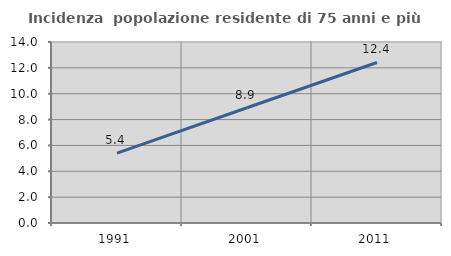
| Category | Incidenza  popolazione residente di 75 anni e più |
|---|---|
| 1991.0 | 5.406 |
| 2001.0 | 8.913 |
| 2011.0 | 12.416 |